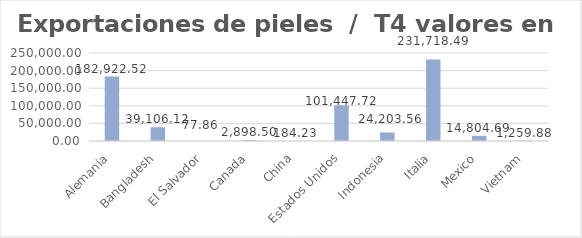
| Category | Valor US  |
|---|---|
| Alemania | 182922.52 |
| Bangladesh | 39106.12 |
| El Salvador | 77.86 |
| Canada | 2898.5 |
| China | 184.23 |
| Estados Unidos | 101447.72 |
| Indonesia | 24203.56 |
| Italia | 231718.49 |
| Mexico | 14804.69 |
| Vietnam | 1259.88 |